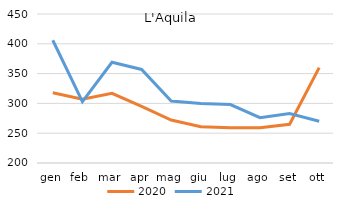
| Category | 2020 | 2021 |
|---|---|---|
| gen | 318 | 406 |
| feb | 307 | 303 |
| mar | 317 | 369 |
| apr | 295 | 357 |
| mag | 272 | 304 |
| giu | 261 | 300 |
| lug | 259 | 298 |
| ago | 259 | 276 |
| set | 265 | 283 |
| ott | 360 | 270 |